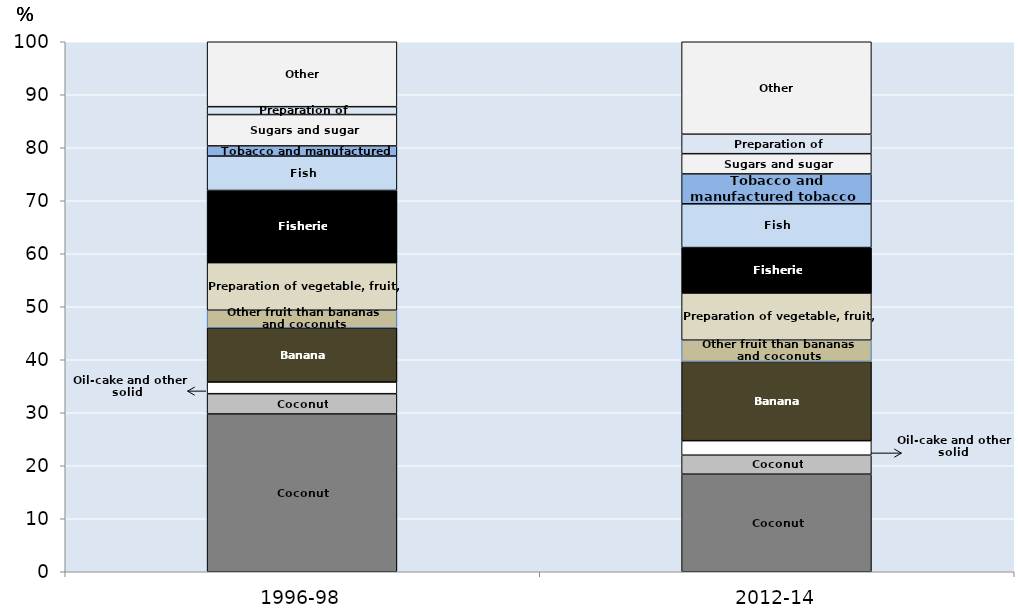
| Category | Coconut oil | Coconuts | Oil-cake and other solid residues of coconut | Bananas | Other fruit than bananas and coconuts | Preparation of vegetable, fruit, nuts | Fisheries | Fish preparations | Tobacco and manufactured tobacco su | Sugars and sugar confectionery. | Preparation of cereal | Other |
|---|---|---|---|---|---|---|---|---|---|---|---|---|
| 1996-98 | 29.769 | 3.829 | 2.198 | 10.23 | 3.32 | 8.977 | 13.618 | 6.489 | 1.916 | 5.917 | 1.488 | 12.247 |
| 2012-14 | 18.409 | 3.585 | 2.74 | 14.946 | 4.019 | 8.908 | 8.559 | 8.256 | 5.636 | 3.825 | 3.67 | 17.446 |